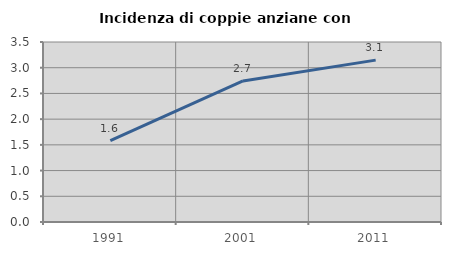
| Category | Incidenza di coppie anziane con figli |
|---|---|
| 1991.0 | 1.581 |
| 2001.0 | 2.742 |
| 2011.0 | 3.147 |